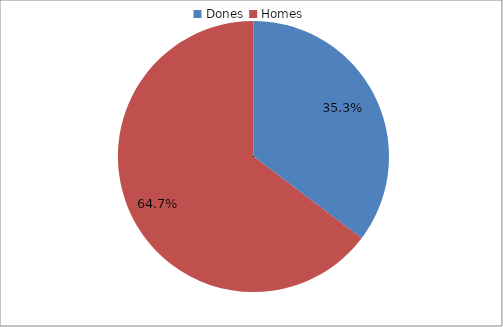
| Category | Series 0 |
|---|---|
| Dones | 0.353 |
| Homes | 0.647 |